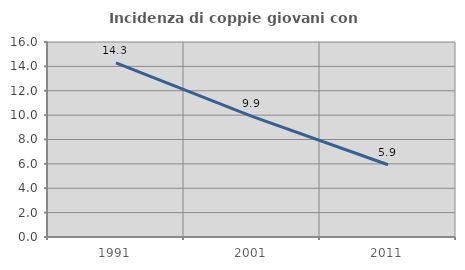
| Category | Incidenza di coppie giovani con figli |
|---|---|
| 1991.0 | 14.286 |
| 2001.0 | 9.904 |
| 2011.0 | 5.929 |